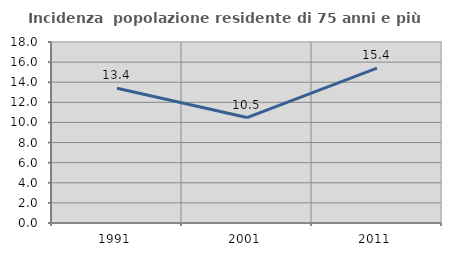
| Category | Incidenza  popolazione residente di 75 anni e più |
|---|---|
| 1991.0 | 13.408 |
| 2001.0 | 10.484 |
| 2011.0 | 15.405 |